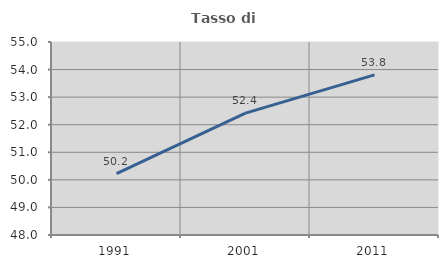
| Category | Tasso di occupazione   |
|---|---|
| 1991.0 | 50.23 |
| 2001.0 | 52.422 |
| 2011.0 | 53.807 |